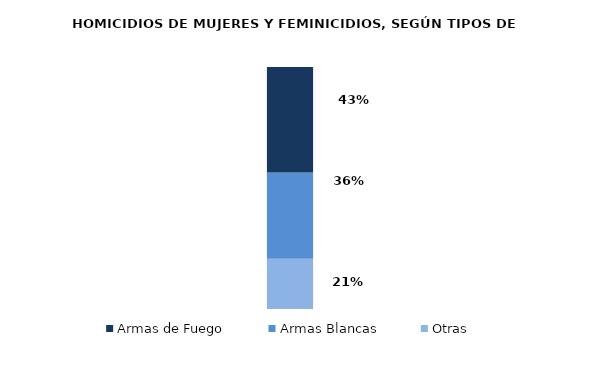
| Category | Otras | Armas Blancas | Armas de Fuego |
|---|---|---|---|
| 0 | 39 | 67 | 82 |